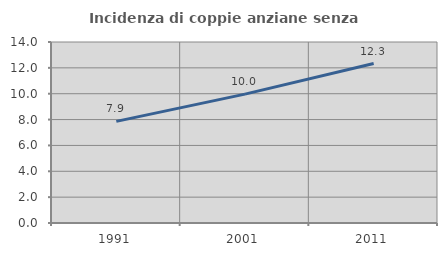
| Category | Incidenza di coppie anziane senza figli  |
|---|---|
| 1991.0 | 7.862 |
| 2001.0 | 9.967 |
| 2011.0 | 12.333 |